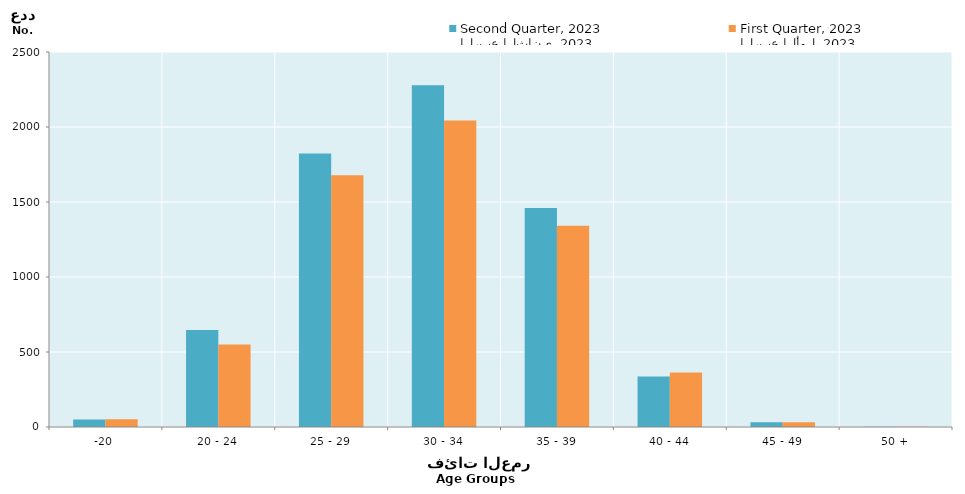
| Category | الربع الثاني، 2023
Second Quarter, 2023 | الربع الأول، 2023
First Quarter, 2023 |
|---|---|---|
| -20 | 50 | 52 |
| 20 - 24 | 646 | 550 |
| 25 - 29 | 1824 | 1678 |
| 30 - 34 | 2279 | 2044 |
| 35 - 39 | 1460 | 1342 |
| 40 - 44 | 336 | 364 |
| 45 - 49 | 31 | 31 |
| 50 + | 2 | 2 |